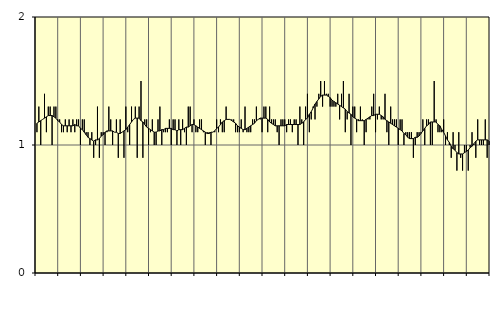
| Category | Piggar | Jordbruk, skogsbruk o fiske, SNI 01-03 |
|---|---|---|
| nan | 1.1 | 1.17 |
| 1.0 | 1.3 | 1.18 |
| 1.0 | 1 | 1.19 |
| 1.0 | 1.2 | 1.2 |
| 1.0 | 1.4 | 1.21 |
| 1.0 | 1.1 | 1.22 |
| 1.0 | 1.3 | 1.23 |
| 1.0 | 1.3 | 1.23 |
| 1.0 | 1 | 1.23 |
| 1.0 | 1.3 | 1.22 |
| 1.0 | 1.3 | 1.21 |
| 1.0 | 1.2 | 1.19 |
| nan | 1.2 | 1.18 |
| 2.0 | 1.1 | 1.16 |
| 2.0 | 1.1 | 1.15 |
| 2.0 | 1.2 | 1.15 |
| 2.0 | 1.1 | 1.15 |
| 2.0 | 1.2 | 1.15 |
| 2.0 | 1.1 | 1.15 |
| 2.0 | 1.2 | 1.15 |
| 2.0 | 1.1 | 1.16 |
| 2.0 | 1.2 | 1.15 |
| 2.0 | 1.2 | 1.15 |
| 2.0 | 1 | 1.13 |
| nan | 1.2 | 1.12 |
| 3.0 | 1.2 | 1.1 |
| 3.0 | 1.1 | 1.08 |
| 3.0 | 1.1 | 1.06 |
| 3.0 | 1 | 1.05 |
| 3.0 | 1.1 | 1.04 |
| 3.0 | 0.9 | 1.03 |
| 3.0 | 1 | 1.04 |
| 3.0 | 1.3 | 1.04 |
| 3.0 | 0.9 | 1.05 |
| 3.0 | 1.1 | 1.07 |
| 3.0 | 1.1 | 1.08 |
| nan | 1 | 1.1 |
| 4.0 | 1.1 | 1.11 |
| 4.0 | 1.3 | 1.11 |
| 4.0 | 1.2 | 1.11 |
| 4.0 | 1 | 1.11 |
| 4.0 | 1.1 | 1.1 |
| 4.0 | 1.2 | 1.1 |
| 4.0 | 0.9 | 1.09 |
| 4.0 | 1.2 | 1.09 |
| 4.0 | 1.1 | 1.1 |
| 4.0 | 0.9 | 1.11 |
| 4.0 | 1.3 | 1.12 |
| nan | 1.1 | 1.14 |
| 5.0 | 1 | 1.16 |
| 5.0 | 1.3 | 1.18 |
| 5.0 | 1.2 | 1.2 |
| 5.0 | 1.3 | 1.21 |
| 5.0 | 0.9 | 1.21 |
| 5.0 | 1.3 | 1.21 |
| 5.0 | 1.5 | 1.19 |
| 5.0 | 0.9 | 1.18 |
| 5.0 | 1.2 | 1.16 |
| 5.0 | 1.2 | 1.14 |
| 5.0 | 1 | 1.13 |
| nan | 1.1 | 1.12 |
| 6.0 | 1.2 | 1.11 |
| 6.0 | 1 | 1.1 |
| 6.0 | 1 | 1.1 |
| 6.0 | 1.2 | 1.11 |
| 6.0 | 1.3 | 1.11 |
| 6.0 | 1 | 1.12 |
| 6.0 | 1.1 | 1.12 |
| 6.0 | 1.1 | 1.13 |
| 6.0 | 1.1 | 1.13 |
| 6.0 | 1.2 | 1.13 |
| 6.0 | 1 | 1.13 |
| nan | 1.2 | 1.12 |
| 7.0 | 1.2 | 1.12 |
| 7.0 | 1 | 1.11 |
| 7.0 | 1.2 | 1.12 |
| 7.0 | 1 | 1.12 |
| 7.0 | 1.2 | 1.12 |
| 7.0 | 1.1 | 1.13 |
| 7.0 | 1 | 1.14 |
| 7.0 | 1.3 | 1.14 |
| 7.0 | 1.3 | 1.15 |
| 7.0 | 1.1 | 1.16 |
| 7.0 | 1.2 | 1.16 |
| nan | 1.1 | 1.15 |
| 8.0 | 1.1 | 1.14 |
| 8.0 | 1.2 | 1.13 |
| 8.0 | 1.2 | 1.12 |
| 8.0 | 1.1 | 1.11 |
| 8.0 | 1 | 1.1 |
| 8.0 | 1.1 | 1.09 |
| 8.0 | 1.1 | 1.09 |
| 8.0 | 1 | 1.1 |
| 8.0 | 1.1 | 1.1 |
| 8.0 | 1.1 | 1.11 |
| 8.0 | 1.2 | 1.13 |
| nan | 1.1 | 1.14 |
| 9.0 | 1.2 | 1.16 |
| 9.0 | 1.1 | 1.18 |
| 9.0 | 1.1 | 1.19 |
| 9.0 | 1.3 | 1.2 |
| 9.0 | 1.2 | 1.2 |
| 9.0 | 1.2 | 1.2 |
| 9.0 | 1.2 | 1.19 |
| 9.0 | 1.2 | 1.18 |
| 9.0 | 1.1 | 1.17 |
| 9.0 | 1.1 | 1.15 |
| 9.0 | 1.1 | 1.14 |
| nan | 1.2 | 1.13 |
| 10.0 | 1.1 | 1.12 |
| 10.0 | 1.3 | 1.12 |
| 10.0 | 1.1 | 1.13 |
| 10.0 | 1.1 | 1.14 |
| 10.0 | 1.1 | 1.15 |
| 10.0 | 1.2 | 1.16 |
| 10.0 | 1.2 | 1.17 |
| 10.0 | 1.3 | 1.19 |
| 10.0 | 1.2 | 1.2 |
| 10.0 | 1.2 | 1.21 |
| 10.0 | 1.1 | 1.21 |
| nan | 1.3 | 1.21 |
| 11.0 | 1.3 | 1.21 |
| 11.0 | 1.1 | 1.2 |
| 11.0 | 1.3 | 1.18 |
| 11.0 | 1.2 | 1.17 |
| 11.0 | 1.2 | 1.16 |
| 11.0 | 1.2 | 1.15 |
| 11.0 | 1.1 | 1.15 |
| 11.0 | 1 | 1.15 |
| 11.0 | 1.2 | 1.15 |
| 11.0 | 1.2 | 1.15 |
| 11.0 | 1.2 | 1.15 |
| nan | 1.1 | 1.16 |
| 12.0 | 1.2 | 1.16 |
| 12.0 | 1.2 | 1.16 |
| 12.0 | 1.1 | 1.16 |
| 12.0 | 1.2 | 1.16 |
| 12.0 | 1.2 | 1.16 |
| 12.0 | 1 | 1.16 |
| 12.0 | 1.3 | 1.16 |
| 12.0 | 1.2 | 1.17 |
| 12.0 | 1 | 1.18 |
| 12.0 | 1.3 | 1.2 |
| 12.0 | 1.4 | 1.21 |
| nan | 1.1 | 1.24 |
| 13.0 | 1.2 | 1.26 |
| 13.0 | 1.3 | 1.29 |
| 13.0 | 1.2 | 1.32 |
| 13.0 | 1.3 | 1.34 |
| 13.0 | 1.4 | 1.36 |
| 13.0 | 1.5 | 1.38 |
| 13.0 | 1.3 | 1.39 |
| 13.0 | 1.5 | 1.39 |
| 13.0 | 1.4 | 1.39 |
| 13.0 | 1.4 | 1.38 |
| 13.0 | 1.3 | 1.37 |
| nan | 1.3 | 1.35 |
| 14.0 | 1.3 | 1.34 |
| 14.0 | 1.3 | 1.33 |
| 14.0 | 1.4 | 1.32 |
| 14.0 | 1.2 | 1.31 |
| 14.0 | 1.4 | 1.3 |
| 14.0 | 1.5 | 1.29 |
| 14.0 | 1.1 | 1.28 |
| 14.0 | 1.2 | 1.26 |
| 14.0 | 1.4 | 1.25 |
| 14.0 | 1 | 1.24 |
| 14.0 | 1.3 | 1.22 |
| nan | 1.3 | 1.21 |
| 15.0 | 1.1 | 1.2 |
| 15.0 | 1.2 | 1.19 |
| 15.0 | 1.3 | 1.19 |
| 15.0 | 1.2 | 1.19 |
| 15.0 | 1 | 1.19 |
| 15.0 | 1.1 | 1.2 |
| 15.0 | 1.2 | 1.21 |
| 15.0 | 1.2 | 1.22 |
| 15.0 | 1.3 | 1.23 |
| 15.0 | 1.4 | 1.23 |
| 15.0 | 1.1 | 1.24 |
| nan | 1.2 | 1.24 |
| 16.0 | 1.3 | 1.24 |
| 16.0 | 1.2 | 1.23 |
| 16.0 | 1.2 | 1.22 |
| 16.0 | 1.4 | 1.2 |
| 16.0 | 1.1 | 1.19 |
| 16.0 | 1 | 1.18 |
| 16.0 | 1.3 | 1.17 |
| 16.0 | 1.2 | 1.16 |
| 16.0 | 1.2 | 1.15 |
| 16.0 | 1.2 | 1.14 |
| 16.0 | 1 | 1.13 |
| nan | 1.2 | 1.12 |
| 17.0 | 1.2 | 1.11 |
| 17.0 | 1 | 1.09 |
| 17.0 | 1.1 | 1.08 |
| 17.0 | 1.1 | 1.06 |
| 17.0 | 1.1 | 1.05 |
| 17.0 | 1.1 | 1.05 |
| 17.0 | 0.9 | 1.05 |
| 17.0 | 1 | 1.06 |
| 17.0 | 1.1 | 1.06 |
| 17.0 | 1.1 | 1.07 |
| 17.0 | 1.1 | 1.09 |
| nan | 1.2 | 1.11 |
| 18.0 | 1 | 1.13 |
| 18.0 | 1.2 | 1.15 |
| 18.0 | 1.2 | 1.16 |
| 18.0 | 1 | 1.18 |
| 18.0 | 1 | 1.18 |
| 18.0 | 1.5 | 1.18 |
| 18.0 | 1.2 | 1.18 |
| 18.0 | 1.1 | 1.16 |
| 18.0 | 1.1 | 1.15 |
| 18.0 | 1.1 | 1.12 |
| 18.0 | 1.2 | 1.1 |
| nan | 1 | 1.07 |
| 19.0 | 1.1 | 1.04 |
| 19.0 | 1 | 1.02 |
| 19.0 | 0.9 | 0.99 |
| 19.0 | 1.1 | 0.97 |
| 19.0 | 1 | 0.96 |
| 19.0 | 0.8 | 0.94 |
| 19.0 | 1.1 | 0.93 |
| 19.0 | 0.9 | 0.93 |
| 19.0 | 0.8 | 0.93 |
| 19.0 | 1 | 0.94 |
| 19.0 | 1 | 0.95 |
| nan | 0.8 | 0.96 |
| 20.0 | 1 | 0.98 |
| 20.0 | 1.1 | 0.99 |
| 20.0 | 1 | 1.01 |
| 20.0 | 0.9 | 1.03 |
| 20.0 | 1.2 | 1.04 |
| 20.0 | 1 | 1.04 |
| 20.0 | 1 | 1.04 |
| 20.0 | 1 | 1.04 |
| 20.0 | 1.2 | 1.04 |
| 20.0 | 0.9 | 1.04 |
| 20.0 | 1 | 1.03 |